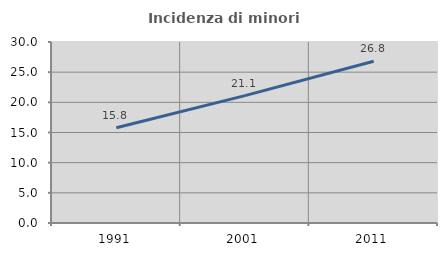
| Category | Incidenza di minori stranieri |
|---|---|
| 1991.0 | 15.789 |
| 2001.0 | 21.118 |
| 2011.0 | 26.817 |